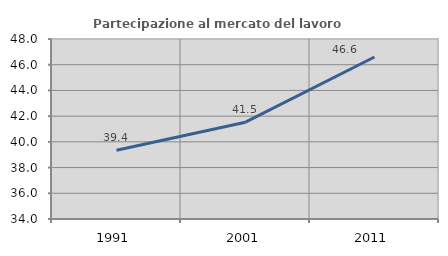
| Category | Partecipazione al mercato del lavoro  femminile |
|---|---|
| 1991.0 | 39.354 |
| 2001.0 | 41.528 |
| 2011.0 | 46.601 |